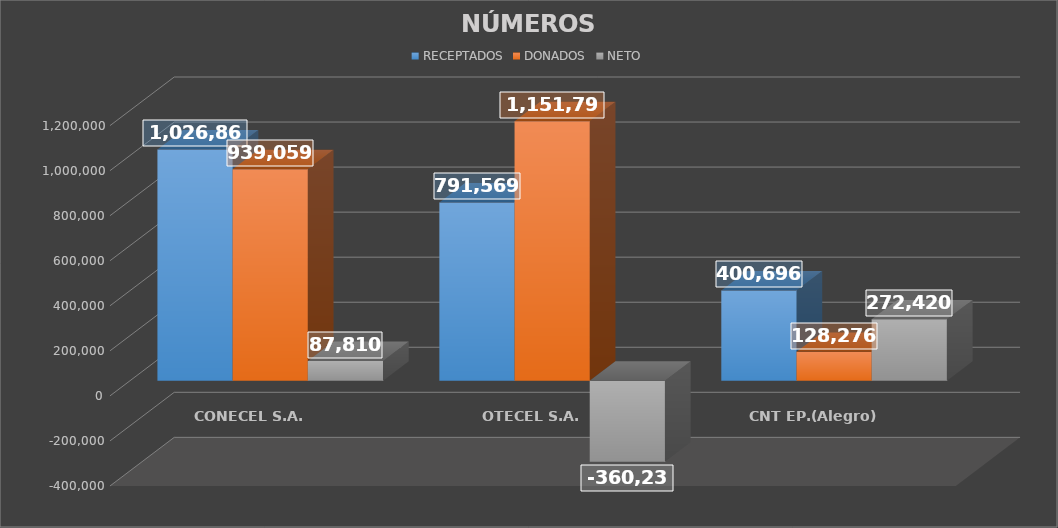
| Category | RECEPTADOS | DONADOS | NETO |
|---|---|---|---|
| CONECEL S.A. | 1026869 | 939059 | 87810 |
| OTECEL S.A. | 791569 | 1151799 | -360230 |
| CNT EP.(Alegro) | 400696 | 128276 | 272420 |